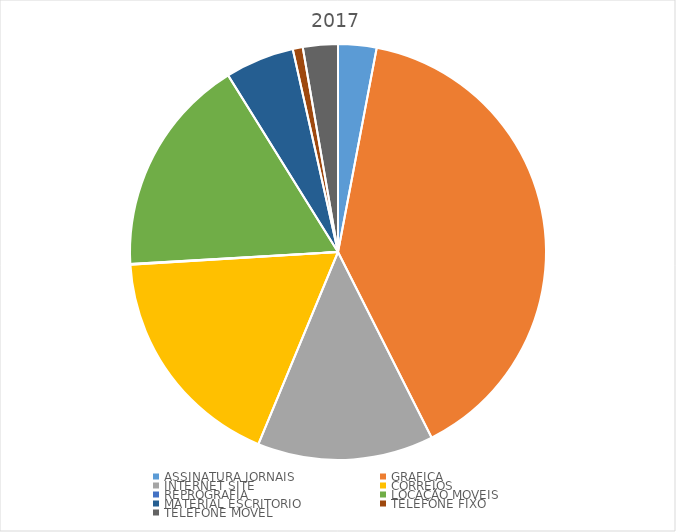
| Category | Series 0 |
|---|---|
| ASSINATURA JORNAIS | 1961.9 |
| GRAFICA | 26025.23 |
| INTERNET SITE | 9000 |
| CORREIOS | 11690.19 |
| REPROGRAFIA | 30.8 |
| LOCAÇÃO MOVEIS | 11220 |
| MATERIAL ESCRITORIO | 3527.2 |
| TELEFONE FIXO | 511.69 |
| TELEFONE MOVEL | 1785.84 |